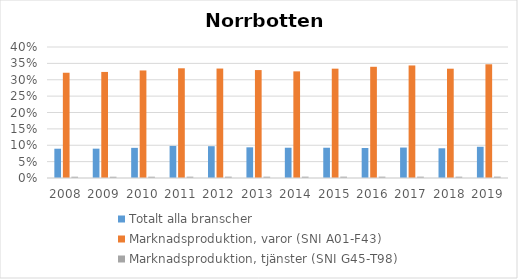
| Category | Totalt alla branscher | Marknadsproduktion, varor (SNI A01-F43) | Marknadsproduktion, tjänster (SNI G45-T98) |
|---|---|---|---|
| 2008.0 | 0.089 | 0.321 | 0.004 |
| 2009.0 | 0.09 | 0.324 | 0.004 |
| 2010.0 | 0.092 | 0.328 | 0.004 |
| 2011.0 | 0.098 | 0.335 | 0.004 |
| 2012.0 | 0.097 | 0.334 | 0.004 |
| 2013.0 | 0.094 | 0.33 | 0.004 |
| 2014.0 | 0.092 | 0.326 | 0.004 |
| 2015.0 | 0.092 | 0.334 | 0.004 |
| 2016.0 | 0.092 | 0.34 | 0.004 |
| 2017.0 | 0.093 | 0.344 | 0.004 |
| 2018.0 | 0.091 | 0.334 | 0.004 |
| 2019.0 | 0.095 | 0.347 | 0.004 |